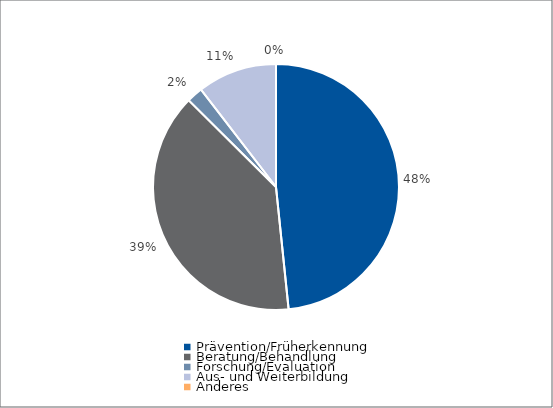
| Category | Series 0 |
|---|---|
| Prävention/Früherkennung | 3426.8 |
| Beratung/Behandlung | 2769.4 |
| Forschung/Evaluation | 150 |
| Aus- und Weiterbildung | 739.8 |
| Anderes | 0 |